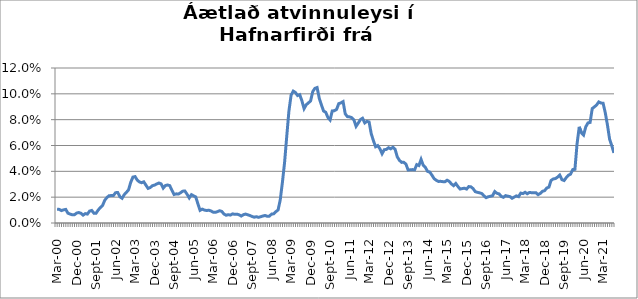
| Category | Series 0 |
|---|---|
| mar.00 | 0.011 |
| apr.00 | 0.011 |
| maí.00 | 0.01 |
| jún.00 | 0.01 |
| júl.00 | 0.011 |
| ágú.00 | 0.008 |
| sep.00 | 0.007 |
| okt.00 | 0.006 |
| nóv.00 | 0.006 |
| des.00 | 0.008 |
| jan.01 | 0.008 |
| feb.01 | 0.008 |
| mar.01 | 0.006 |
| apr.01 | 0.007 |
| maí.01 | 0.007 |
| jún.01 | 0.009 |
| júl.01 | 0.01 |
| ágú.01 | 0.008 |
| sep.01 | 0.008 |
| okt.01 | 0.01 |
| nóv.01 | 0.012 |
| des.01 | 0.014 |
| jan.02 | 0.018 |
| feb.02 | 0.02 |
| mar.02 | 0.021 |
| apr.02 | 0.021 |
| maí.02 | 0.021 |
| jún.02 | 0.023 |
| júl.02 | 0.024 |
| ágú.02 | 0.02 |
| sep.02 | 0.019 |
| okt.02 | 0.022 |
| nóv.02 | 0.024 |
| des.02 | 0.026 |
| jan.03 | 0.032 |
| feb.03 | 0.036 |
| mar.03 | 0.036 |
| apr.03 | 0.033 |
| maí.03 | 0.032 |
| jún.03 | 0.031 |
| júl.03 | 0.032 |
| ágú.03 | 0.029 |
| sep.03 | 0.027 |
| okt.03 | 0.027 |
| nóv.03 | 0.029 |
| des.03 | 0.029 |
| jan.04 | 0.03 |
| feb.04 | 0.031 |
| mar.04 | 0.03 |
| apr.04 | 0.027 |
| maí.04 | 0.029 |
| jún.04 | 0.029 |
| júl.04 | 0.029 |
| ágú.04 | 0.025 |
| sep.04 | 0.022 |
| okt.04 | 0.023 |
| nóv.04 | 0.022 |
| des.04 | 0.023 |
| jan.05 | 0.025 |
| feb.05 | 0.025 |
| mar.05 | 0.022 |
| apr.05 | 0.019 |
| maí.05 | 0.022 |
| jún.05 | 0.021 |
| júl.05 | 0.02 |
| ágú.05 | 0.015 |
| sep.05 | 0.01 |
| okt.05 | 0.011 |
| nóv.05 | 0.01 |
| des.05 | 0.01 |
| jan.06 | 0.01 |
| feb.06 | 0.009 |
| mar.06 | 0.008 |
| apr.06 | 0.008 |
| maí.06 | 0.009 |
| jún.06 | 0.009 |
| júl.06 | 0.009 |
| ágú.06 | 0.007 |
| sep.06 | 0.006 |
| okt.06 | 0.006 |
| nóv.06 | 0.006 |
| des.06 | 0.007 |
| jan.07 | 0.007 |
| feb.07 | 0.007 |
| mar.07 | 0.006 |
| apr.07 | 0.005 |
| maí.07 | 0.006 |
| jún.07 | 0.007 |
| júl.07 | 0.006 |
| ágú.07 | 0.006 |
| sep.07 | 0.005 |
| okt.07 | 0.005 |
| nóv.07 | 0.005 |
| des.07 | 0.004 |
| jan.08 | 0.005 |
| feb.08 | 0.005 |
| mar.08 | 0.006 |
| apr.08 | 0.005 |
| maí.08 | 0.005 |
| jún.08 | 0.007 |
| júl.08 | 0.007 |
| ágú.08 | 0.009 |
| sep.08 | 0.01 |
| okt.08 | 0.018 |
| nóv.08 | 0.031 |
| des.08 | 0.047 |
| jan.09 | 0.067 |
| feb.09 | 0.087 |
| mar.09 | 0.099 |
| apr.09 | 0.102 |
| maí.09 | 0.101 |
| jún.09 | 0.099 |
| júl.09 | 0.099 |
| ágú.09 | 0.095 |
| sep.09 | 0.089 |
| okt.09 | 0.092 |
| nóv.09 | 0.093 |
| des.09 | 0.094 |
| jan.10 | 0.102 |
| feb.10 | 0.104 |
| mar.10 | 0.105 |
| apr.10 | 0.097 |
| maí.10 | 0.091 |
| jún.10 | 0.087 |
| júl.10 | 0.086 |
| ágú.10 | 0.082 |
| sep.10 | 0.08 |
| okt.10 | 0.087 |
| nóv.10 | 0.087 |
| des.10 | 0.088 |
| jan.11 | 0.092 |
| feb.11 | 0.093 |
| mar.11 | 0.094 |
| apr.11 | 0.084 |
| maí.11 | 0.082 |
| jún.11 | 0.082 |
| júl.11 | 0.082 |
| ágú.11 | 0.08 |
| sep.11 | 0.075 |
| okt.11 | 0.077 |
| nóv.11 | 0.08 |
| des.11 | 0.081 |
| jan.12 | 0.077 |
| feb.12 | 0.079 |
| mar.12 | 0.078 |
| apr.12 | 0.069 |
| maí.12 | 0.064 |
| jún.12 | 0.059 |
| júl.12 | 0.06 |
| ágú.12 | 0.057 |
| sep.12 | 0.054 |
| okt.12 | 0.057 |
| nóv.12 | 0.057 |
| des.12 | 0.058 |
| jan.13 | 0.057 |
| feb.13 | 0.059 |
| mar.13 | 0.057 |
| apr.13 | 0.051 |
| maí.13 | 0.049 |
| jún.13 | 0.047 |
| júl.13 | 0.047 |
| ágú.13 | 0.046 |
| sep.13 | 0.041 |
| okt.13 | 0.041 |
| nóv.13 | 0.041 |
| des.13 | 0.041 |
| jan.14 | 0.045 |
| feb.14 | 0.045 |
| mar.14 | 0.049 |
| apr.14 | 0.045 |
| maí.14 | 0.043 |
| jún.14 | 0.04 |
| júl.14 | 0.039 |
| ágú.14 | 0.037 |
| sep.14 | 0.034 |
| okt.14 | 0.033 |
| nóv.14 | 0.032 |
| des.14 | 0.032 |
| jan.15 | 0.032 |
| feb.15 | 0.032 |
| mar.15 | 0.033 |
| apr.15 | 0.032 |
| maí.15 | 0.03 |
| jún.15 | 0.029 |
| júl.15 | 0.031 |
| ágú.15 | 0.028 |
| sep.15 | 0.026 |
| okt.15 | 0.027 |
| nóv.15 | 0.027 |
| des.15 | 0.026 |
| jan.16 | 0.028 |
| feb.16 | 0.028 |
| mar.16 | 0.027 |
| apr.16 | 0.024 |
| maí.16 | 0.024 |
| jún.16 | 0.023 |
| júl.16 | 0.023 |
| ágú.16 | 0.021 |
| sep.16 | 0.02 |
| okt.16 | 0.02 |
| nóv.16 | 0.021 |
| des.16 | 0.021 |
| jan.17 | 0.024 |
| feb.17 | 0.023 |
| mar.17 | 0.023 |
| apr.17 | 0.021 |
| maí.17 | 0.02 |
| jún.17 | 0.021 |
| júl.17 | 0.021 |
| ágú.17 | 0.02 |
| sep.17 | 0.019 |
| okt.17 | 0.02 |
| nóv.17 | 0.021 |
| des.17 | 0.02 |
| jan.18 | 0.023 |
| feb.18 | 0.023 |
| mar.18 | 0.024 |
| apr.18 | 0.023 |
| maí.18 | 0.024 |
| jún.18 | 0.023 |
| júl.18 | 0.023 |
| ágú.18 | 0.023 |
| sep.18 | 0.022 |
| okt.18 | 0.023 |
| nóv.18 | 0.025 |
| des.18 | 0.025 |
| jan.19 | 0.027 |
| feb.19 | 0.028 |
| mar.19 | 0.033 |
| apr.19 | 0.034 |
| maí.19 | 0.034 |
| jún.19 | 0.036 |
| júl.19 | 0.037 |
| ágú.19 | 0.034 |
| sep.19 | 0.033 |
| okt.19 | 0.035 |
| nóv.19 | 0.037 |
| des.19 | 0.038 |
| jan.20 | 0.041 |
| feb.20 | 0.042 |
| mar.2020* | 0.061 |
| apr.20 | 0.074 |
| Maí - 20 | 0.07 |
| jún.20 | 0.068 |
| júl.20 | 0.074 |
| ágú.20 | 0.077 |
| sep.20 | 0.078 |
| okt. 20 | 0.089 |
| nóv.20 | 0.09 |
| des.20 | 0.091 |
| jan.21 | 0.094 |
| feb.21 | 0.093 |
| mar.21 | 0.093 |
| apr.21 | 0.085 |
| maí.21 | 0.076 |
| jún.21 | 0.065 |
| júl.21 | 0.06 |
| ágú.21 | 0.054 |